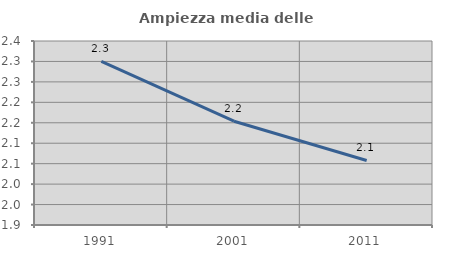
| Category | Ampiezza media delle famiglie |
|---|---|
| 1991.0 | 2.3 |
| 2001.0 | 2.154 |
| 2011.0 | 2.058 |